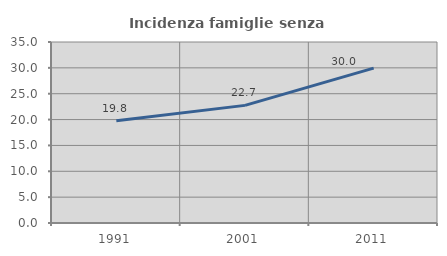
| Category | Incidenza famiglie senza nuclei |
|---|---|
| 1991.0 | 19.785 |
| 2001.0 | 22.744 |
| 2011.0 | 29.954 |